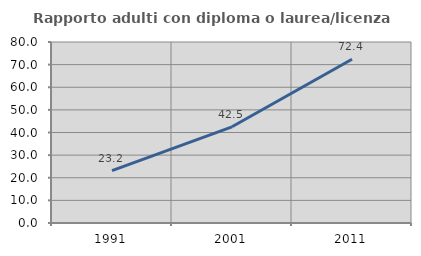
| Category | Rapporto adulti con diploma o laurea/licenza media  |
|---|---|
| 1991.0 | 23.168 |
| 2001.0 | 42.52 |
| 2011.0 | 72.404 |